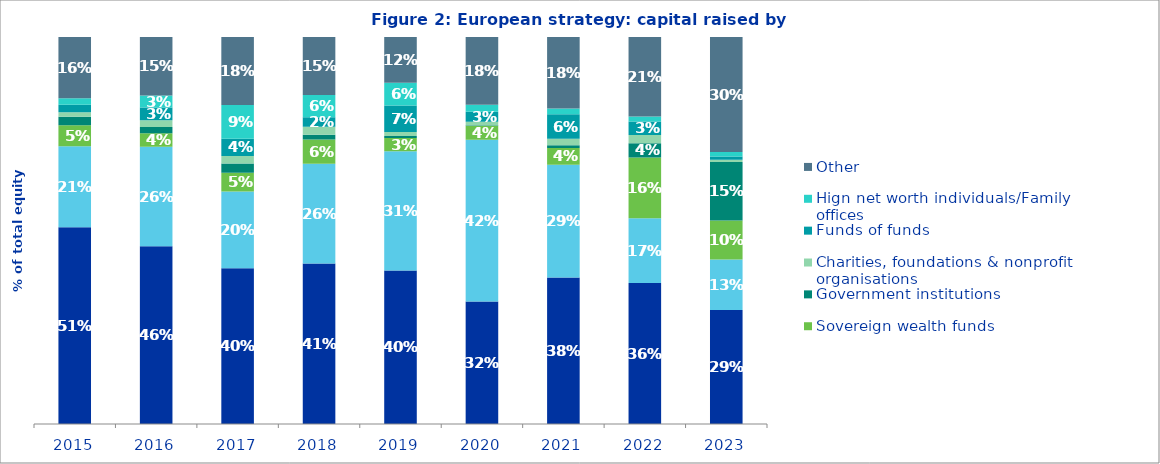
| Category | Pension funds | Insurance companies | Sovereign wealth funds | Government institutions | Charities, foundations & nonprofit organisations | Funds of funds | Hign net worth individuals/Family offices | Other |
|---|---|---|---|---|---|---|---|---|
| 0 | 0.509 | 0.209 | 0.054 | 0.022 | 0.012 | 0.019 | 0.017 | 0.159 |
| 1 | 0.459 | 0.257 | 0.035 | 0.016 | 0.017 | 0.033 | 0.031 | 0.151 |
| 2 | 0.402 | 0.199 | 0.048 | 0.024 | 0.02 | 0.045 | 0.087 | 0.176 |
| 3 | 0.415 | 0.258 | 0.063 | 0.012 | 0.021 | 0.025 | 0.057 | 0.15 |
| 4 | 0.396 | 0.308 | 0.034 | 0.005 | 0.01 | 0.068 | 0.059 | 0.118 |
| 5 | 0.317 | 0.418 | 0.037 | 0.001 | 0.009 | 0.026 | 0.018 | 0.175 |
| 6 | 0.378 | 0.292 | 0.043 | 0.007 | 0.017 | 0.063 | 0.015 | 0.185 |
| 7 | 0.364 | 0.168 | 0.157 | 0.037 | 0.021 | 0.035 | 0.013 | 0.206 |
| 8 | 0.295 | 0.13 | 0.101 | 0.151 | 0.006 | 0.009 | 0.011 | 0.297 |